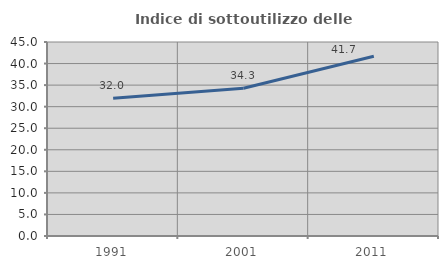
| Category | Indice di sottoutilizzo delle abitazioni  |
|---|---|
| 1991.0 | 31.979 |
| 2001.0 | 34.262 |
| 2011.0 | 41.681 |